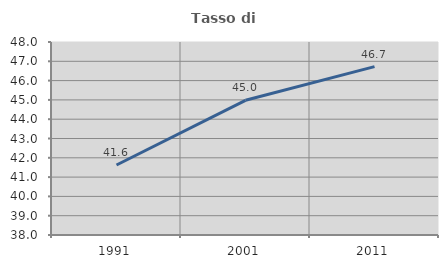
| Category | Tasso di occupazione   |
|---|---|
| 1991.0 | 41.627 |
| 2001.0 | 44.978 |
| 2011.0 | 46.725 |